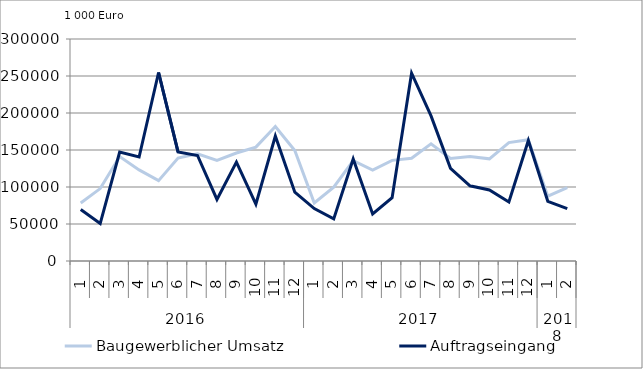
| Category | Baugewerblicher Umsatz | Auftragseingang |
|---|---|---|
| 0 | 78291.738 | 69470.357 |
| 1 | 97863.379 | 50640.033 |
| 2 | 141176.119 | 147206.65 |
| 3 | 123121.297 | 140579.009 |
| 4 | 108561.124 | 254739.334 |
| 5 | 139030.209 | 147481.644 |
| 6 | 144784.416 | 142609.658 |
| 7 | 135870.195 | 83192.156 |
| 8 | 145961.738 | 133594.351 |
| 9 | 153886.826 | 76793.838 |
| 10 | 181740.037 | 168867.568 |
| 11 | 149348.138 | 93011.853 |
| 12 | 78446.78 | 70908.903 |
| 13 | 99841.908 | 56868.408 |
| 14 | 135679.867 | 137790.423 |
| 15 | 123004.403 | 63637.761 |
| 16 | 136010.071 | 85644.63 |
| 17 | 138859.308 | 253791.552 |
| 18 | 158353.879 | 196034.198 |
| 19 | 138510.315 | 125319.873 |
| 20 | 141109.925 | 101690.626 |
| 21 | 138067.098 | 95966.626 |
| 22 | 160064.454 | 79701.993 |
| 23 | 163969.017 | 162878.607 |
| 24 | 87640.529 | 80684.627 |
| 25 | 99259.455 | 70746.763 |